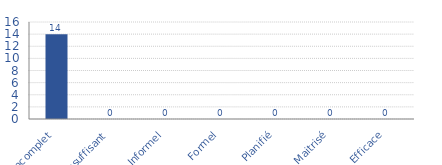
| Category | Tracé de l'Histogramme "Bonnes Pratiques" |
|---|---|
| Incomplet | 14 |
| Insuffisant | 0 |
| Informel | 0 |
| Formel | 0 |
| Planifié | 0 |
| Maitrisé | 0 |
| Efficace | 0 |